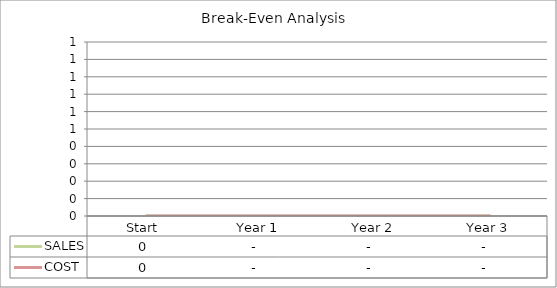
| Category | SALES | COST |
|---|---|---|
| Start | 0 | 0 |
| Year 1 | 0 | 0 |
| Year 2 | 0 | 0 |
| Year 3 | 0 | 0 |